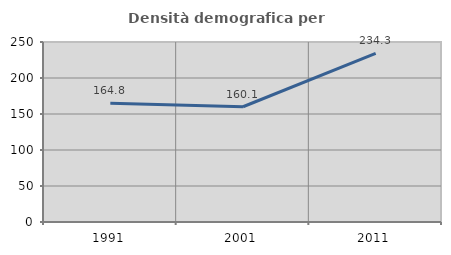
| Category | Densità demografica |
|---|---|
| 1991.0 | 164.788 |
| 2001.0 | 160.062 |
| 2011.0 | 234.317 |